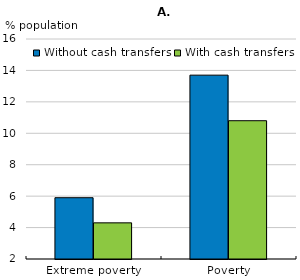
| Category | Without cash transfers | With cash transfers |
|---|---|---|
| Extreme poverty | 5.9 | 4.3 |
| Poverty | 13.7 | 10.8 |